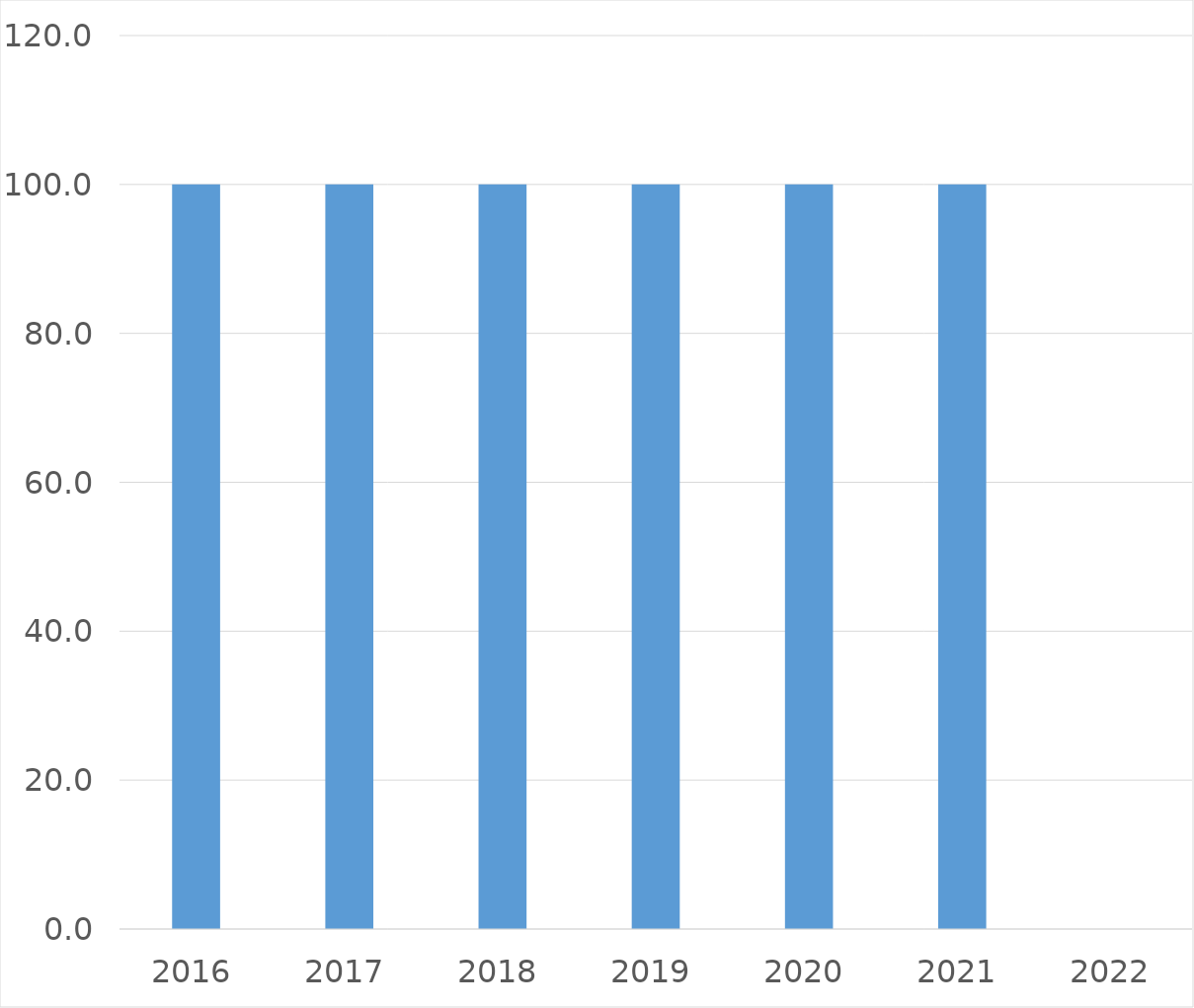
| Category | Series 0 |
|---|---|
| 2016 | 100 |
| 2017 | 100 |
| 2018 | 100 |
| 2019 | 100 |
| 2020 | 100 |
| 2021 | 100 |
| 2022 | 0 |